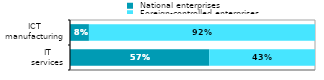
| Category |  National enterprises |  Foreign-controlled enterprises |
|---|---|---|
|  IT 
services | 0.568 | 0.432 |
|  ICT 
manufacturing | 0.077 | 0.923 |